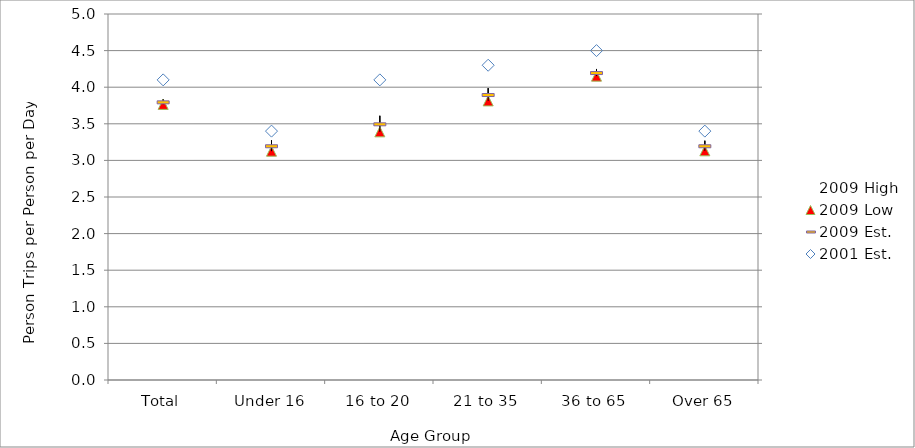
| Category | 2009 High | 2009 Low | 2009 Est. |
|---|---|---|---|
| Total | 3.835 | 3.765 | 3.8 |
| Under 16 | 3.274 | 3.126 | 3.2 |
| 16 to 20 | 3.61 | 3.39 | 3.5 |
| 21 to 35 | 3.987 | 3.813 | 3.9 |
| 36 to 65 | 4.249 | 4.151 | 4.2 |
| Over 65 | 3.269 | 3.131 | 3.2 |